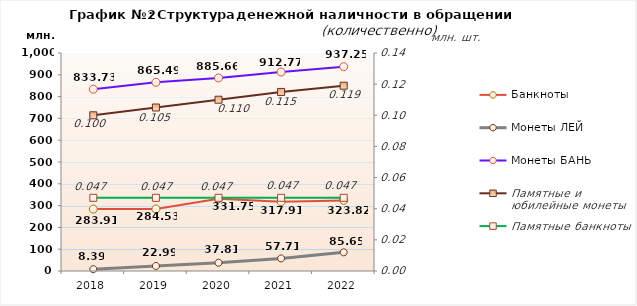
| Category | Банкноты | Монеты ЛЕЙ | Монеты БАНЬ |
|---|---|---|---|
| 2018 | 283.91 | 8.39 | 833.73 |
| 2019 | 284.53 | 22.99 | 865.49 |
| 2020 | 331.75 | 37.81 | 885.66 |
| 2021 | 317.91 | 57.71 | 912.77 |
| 2022 | 323.82 | 85.65 | 937.25 |